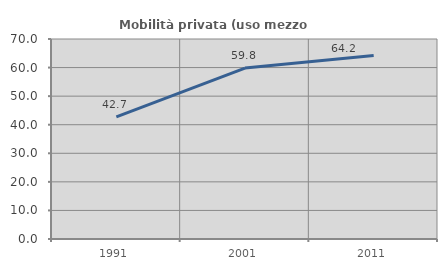
| Category | Mobilità privata (uso mezzo privato) |
|---|---|
| 1991.0 | 42.712 |
| 2001.0 | 59.82 |
| 2011.0 | 64.216 |